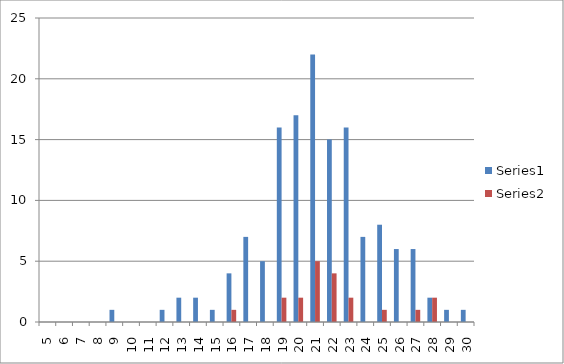
| Category | Series 0 | Series 1 |
|---|---|---|
| 5.0 | 0 | 0 |
| 6.0 | 0 | 0 |
| 7.0 | 0 | 0 |
| 8.0 | 0 | 0 |
| 9.0 | 1 | 0 |
| 10.0 | 0 | 0 |
| 11.0 | 0 | 0 |
| 12.0 | 1 | 0 |
| 13.0 | 2 | 0 |
| 14.0 | 2 | 0 |
| 15.0 | 1 | 0 |
| 16.0 | 4 | 1 |
| 17.0 | 7 | 0 |
| 18.0 | 5 | 0 |
| 19.0 | 16 | 2 |
| 20.0 | 17 | 2 |
| 21.0 | 22 | 5 |
| 22.0 | 15 | 4 |
| 23.0 | 16 | 2 |
| 24.0 | 7 | 0 |
| 25.0 | 8 | 1 |
| 26.0 | 6 | 0 |
| 27.0 | 6 | 1 |
| 28.0 | 2 | 2 |
| 29.0 | 1 | 0 |
| 30.0 | 1 | 0 |